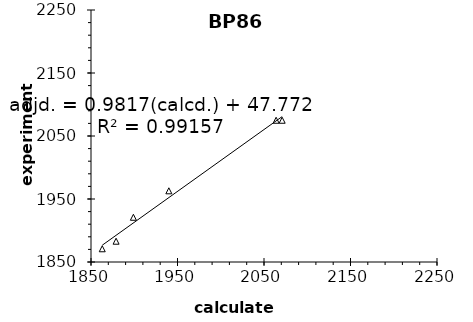
| Category | BP86 |
|---|---|
| 1863.0 | 1871 |
| 1879.0 | 1883 |
| 1899.0 | 1921 |
| 1940.0 | 1963 |
| 2064.0 | 2075 |
| 2071.0 | 2075 |